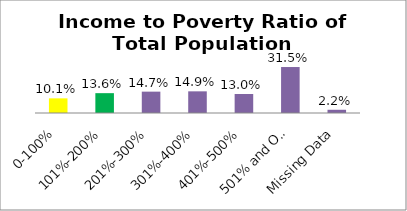
| Category | Percent |
|---|---|
| 0-100% | 0.101 |
| 101%-200% | 0.136 |
| 201%-300% | 0.147 |
| 301%-400% | 0.149 |
| 401%-500% | 0.13 |
| 501% and Over | 0.315 |
| Missing Data | 0.022 |